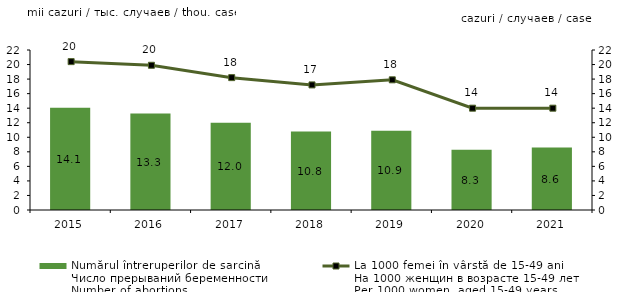
| Category | Numărul întreruperilor de sarcină
Число прерываний беременности
Number of abortions  |
|---|---|
| 2015.0 | 14.059 |
| 2016.0 | 13.285 |
| 2017.0 | 12 |
| 2018.0 | 10.8 |
| 2019.0 | 10.9 |
| 2020.0 | 8.3 |
| 2021.0 | 8.6 |